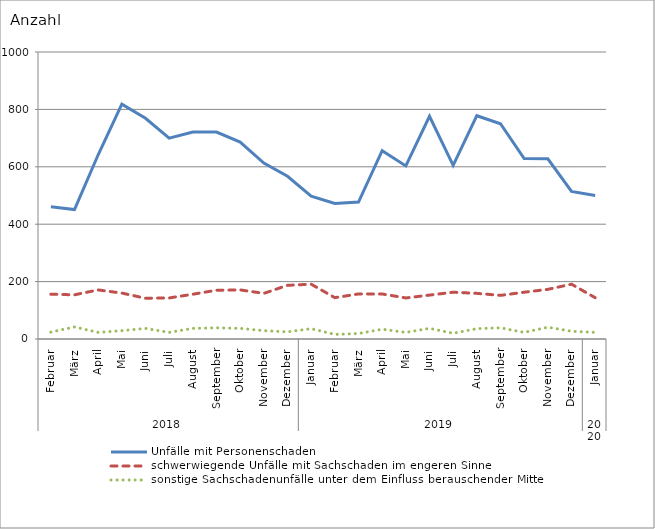
| Category | Unfälle mit Personenschaden | schwerwiegende Unfälle mit Sachschaden im engeren Sinne | sonstige Sachschadenunfälle unter dem Einfluss berauschender Mittel |
|---|---|---|---|
| 0 | 461 | 156 | 24 |
| 1 | 451 | 154 | 42 |
| 2 | 642 | 171 | 23 |
| 3 | 818 | 160 | 29 |
| 4 | 769 | 142 | 37 |
| 5 | 700 | 143 | 23 |
| 6 | 721 | 156 | 37 |
| 7 | 721 | 170 | 39 |
| 8 | 686 | 171 | 37 |
| 9 | 613 | 159 | 29 |
| 10 | 567 | 187 | 25 |
| 11 | 498 | 191 | 36 |
| 12 | 472 | 144 | 16 |
| 13 | 477 | 157 | 19 |
| 14 | 656 | 157 | 34 |
| 15 | 603 | 143 | 23 |
| 16 | 776 | 153 | 37 |
| 17 | 605 | 163 | 20 |
| 18 | 778 | 159 | 36 |
| 19 | 750 | 152 | 39 |
| 20 | 629 | 163 | 23 |
| 21 | 628 | 173 | 41 |
| 22 | 514 | 191 | 27 |
| 23 | 500 | 144 | 23 |